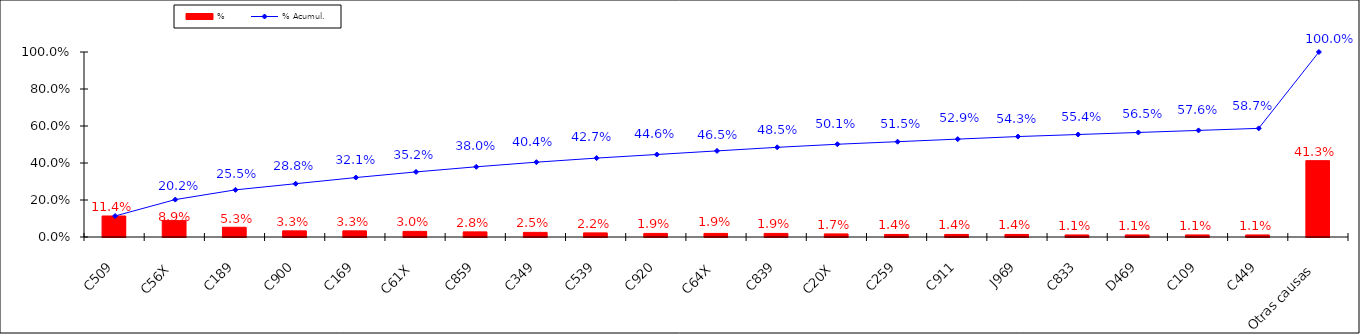
| Category | % |
|---|---|
| C509 | 0.114 |
| C56X | 0.089 |
| C189 | 0.053 |
| C900 | 0.033 |
| C169 | 0.033 |
| C61X | 0.03 |
| C859 | 0.028 |
| C349 | 0.025 |
| C539 | 0.022 |
| C920 | 0.019 |
| C64X | 0.019 |
| C839 | 0.019 |
| C20X | 0.017 |
| C259 | 0.014 |
| C911 | 0.014 |
| J969 | 0.014 |
| C833 | 0.011 |
| D469 | 0.011 |
| C109 | 0.011 |
| C449 | 0.011 |
| Otras causas | 0.413 |